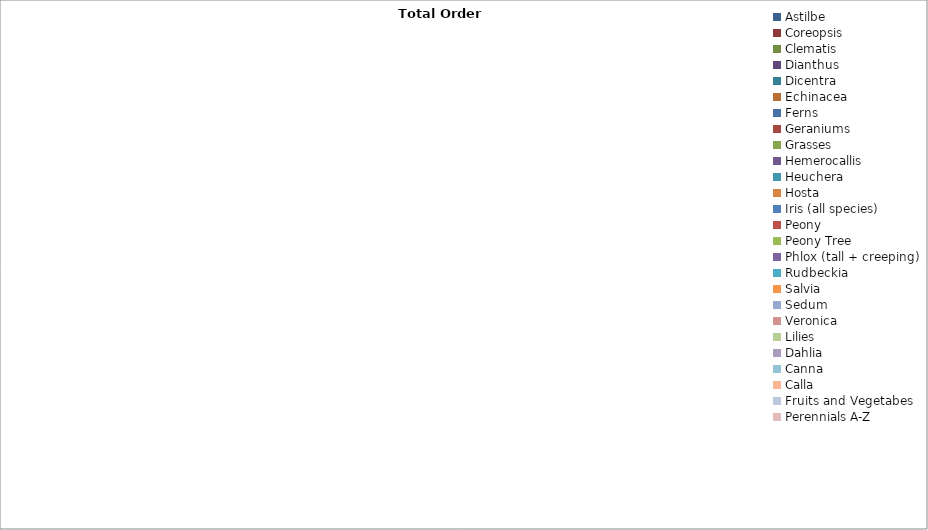
| Category | Series 0 |
|---|---|
| Astilbe | 0 |
| Coreopsis | 0 |
| Clematis | 0 |
| Dianthus | 0 |
| Dicentra | 0 |
| Echinacea | 0 |
| Ferns | 0 |
| Geraniums | 0 |
| Grasses | 0 |
| Hemerocallis | 0 |
| Heuchera | 0 |
| Hosta | 0 |
| Iris (all species) | 0 |
| Peony | 0 |
| Peony Tree | 0 |
| Phlox (tall + creeping) | 0 |
| Rudbeckia | 0 |
| Salvia | 0 |
| Sedum | 0 |
| Veronica | 0 |
| Lilies | 0 |
| Dahlia | 0 |
| Canna | 0 |
| Calla | 0 |
| Fruits and Vegetabes | 0 |
| Perennials A-Z | 0 |